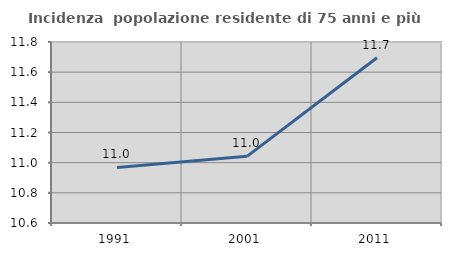
| Category | Incidenza  popolazione residente di 75 anni e più |
|---|---|
| 1991.0 | 10.968 |
| 2001.0 | 11.042 |
| 2011.0 | 11.696 |